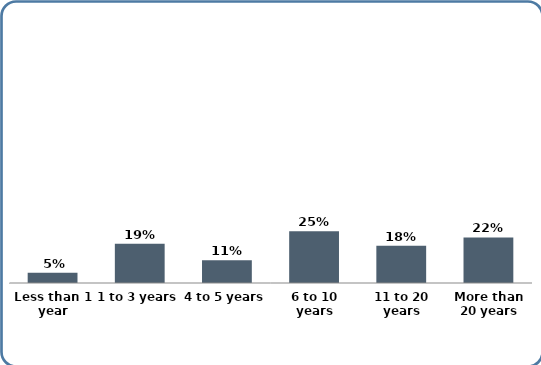
| Category | Series 0 |
|---|---|
| Less than 1 year | 0.05 |
| 1 to 3 years | 0.19 |
| 4 to 5 years | 0.11 |
| 6 to 10 years | 0.25 |
| 11 to 20 years | 0.18 |
| More than 20 years | 0.22 |